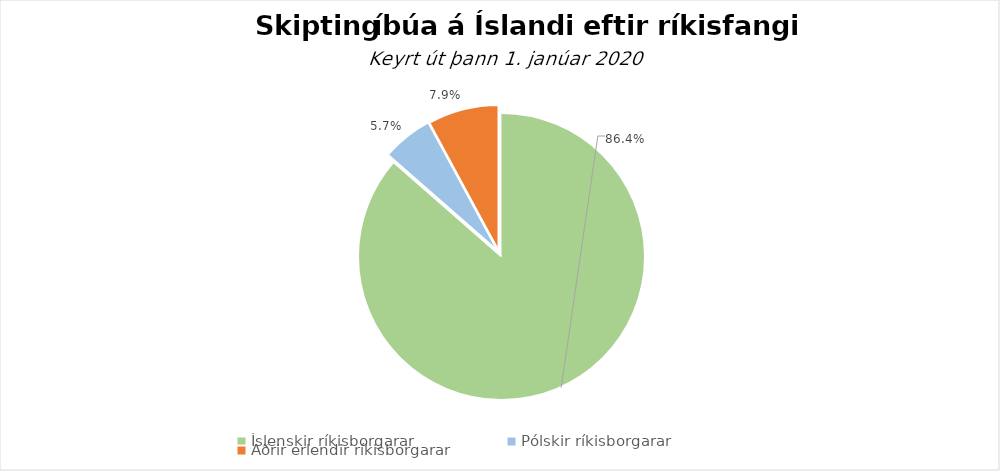
| Category | Series 0 |
|---|---|
| Íslenskir ríkisborgarar | 0.864 |
| Pólskir ríkisborgarar | 0.057 |
| Aðrir erlendir ríkisborgarar | 0.079 |